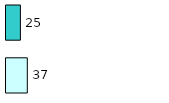
| Category | Series 0 | Series 1 |
|---|---|---|
| 0 | 37 | 25 |